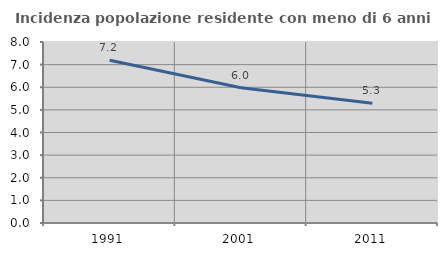
| Category | Incidenza popolazione residente con meno di 6 anni |
|---|---|
| 1991.0 | 7.195 |
| 2001.0 | 5.981 |
| 2011.0 | 5.292 |